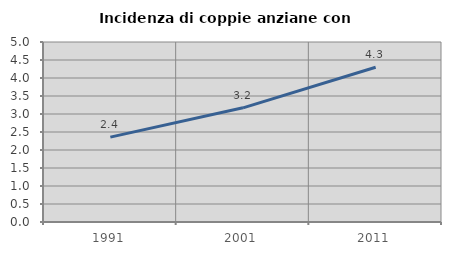
| Category | Incidenza di coppie anziane con figli |
|---|---|
| 1991.0 | 2.358 |
| 2001.0 | 3.172 |
| 2011.0 | 4.299 |